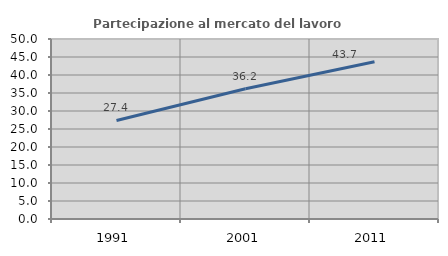
| Category | Partecipazione al mercato del lavoro  femminile |
|---|---|
| 1991.0 | 27.371 |
| 2001.0 | 36.176 |
| 2011.0 | 43.704 |